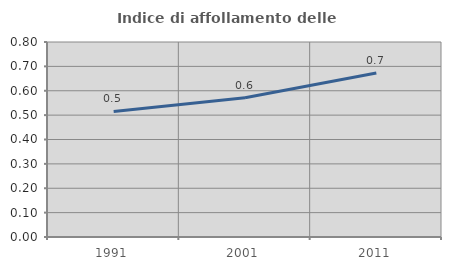
| Category | Indice di affollamento delle abitazioni  |
|---|---|
| 1991.0 | 0.515 |
| 2001.0 | 0.571 |
| 2011.0 | 0.673 |